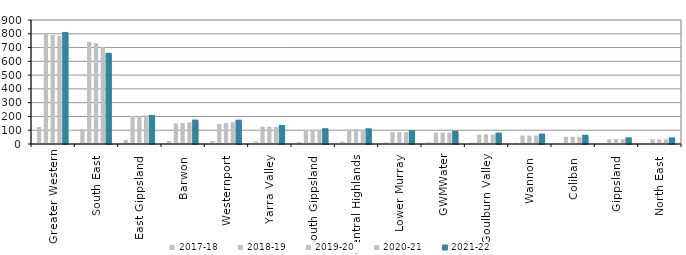
| Category | 2017-18 | 2018-19 | 2019-20 | 2020-21 | 2021-22 |
|---|---|---|---|---|---|
| Greater Western | 123.28 | 800.168 | 789.711 | 785.022 | 798.57 |
| South East  | 108.204 | 741.695 | 732.697 | 705.147 | 647.429 |
| East Gippsland  | 29.988 | 203.495 | 204.864 | 206.618 | 195.907 |
| Barwon  | 22.612 | 149.804 | 152.983 | 158.198 | 163.058 |
| Westernport  | 22.663 | 145.996 | 153.03 | 158.832 | 161.961 |
| Yarra Valley  | 18.587 | 126.492 | 125.387 | 122.839 | 123.234 |
| South Gippsland  | 15 | 101.298 | 100.358 | 100.459 | 100.459 |
| Central Highlands  | 18.322 | 103.3 | 108.339 | 93.691 | 99.639 |
| Lower Murray  | 12.76 | 85.871 | 85.938 | 86.052 | 85.764 |
| GWMWater | 12.129 | 82.677 | 82.156 | 82.81 | 81.943 |
| Goulburn Valley  | 10.365 | 67.622 | 70.69 | 68.078 | 68.167 |
| Wannon  | 9.119 | 61.498 | 61.356 | 60.877 | 61.097 |
| Coliban  | 7.81 | 52.495 | 52.677 | 52.669 | 52.414 |
| Gippsland  | 4.663 | 34.074 | 36.189 | 34.165 | 33.961 |
| North East  | 5.756 | 34.248 | 33.53 | 33.881 | 33.657 |